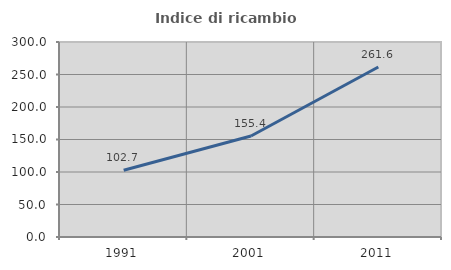
| Category | Indice di ricambio occupazionale  |
|---|---|
| 1991.0 | 102.66 |
| 2001.0 | 155.354 |
| 2011.0 | 261.588 |